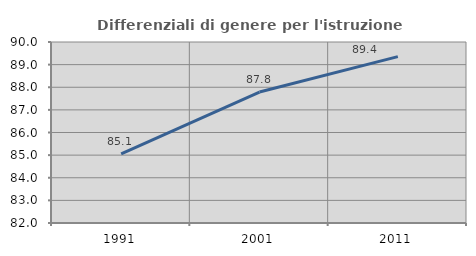
| Category | Differenziali di genere per l'istruzione superiore |
|---|---|
| 1991.0 | 85.051 |
| 2001.0 | 87.788 |
| 2011.0 | 89.353 |